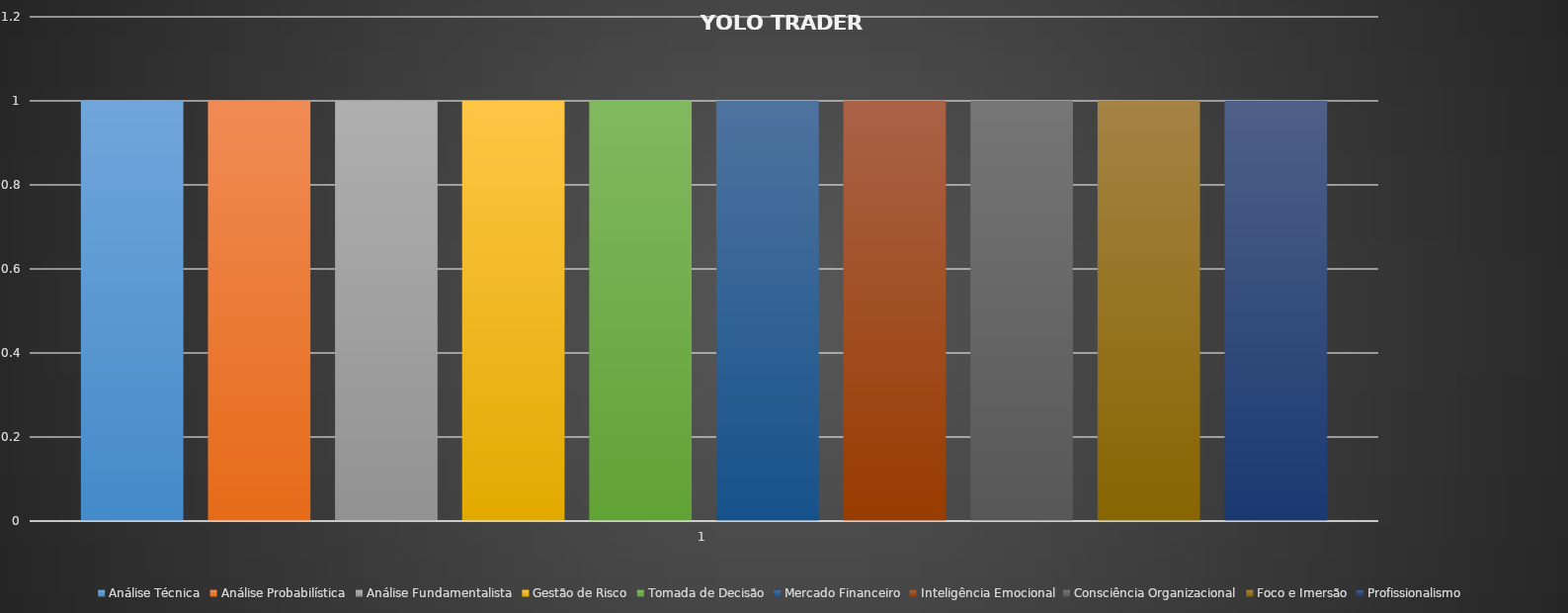
| Category | Análise Técnica | Análise Probabilística | Análise Fundamentalista | Gestão de Risco | Tomada de Decisão | Mercado Financeiro | Inteligência Emocional | Consciência Organizacional | Foco e Imersão | Profissionalismo |
|---|---|---|---|---|---|---|---|---|---|---|
| 1.0 | 1 | 1 | 1 | 1 | 1 | 1 | 1 | 1 | 1 | 1 |